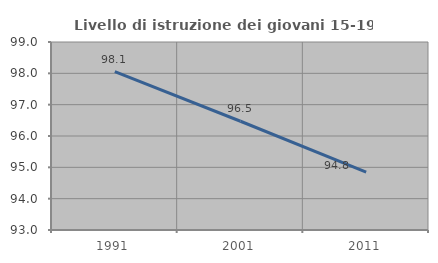
| Category | Livello di istruzione dei giovani 15-19 anni |
|---|---|
| 1991.0 | 98.052 |
| 2001.0 | 96.471 |
| 2011.0 | 94.845 |